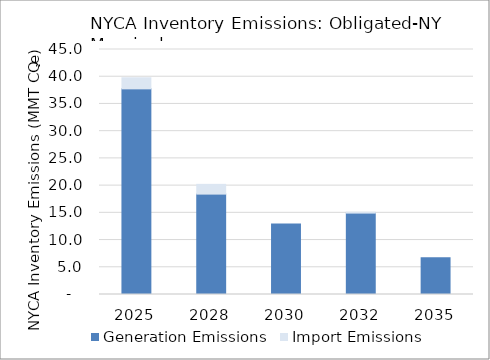
| Category | Generation Emissions  | Import Emissions |
|---|---|---|
| 2025.0 | 37.77 | 2.04 |
| 2028.0 | 18.44 | 1.79 |
| 2030.0 | 12.97 | 0 |
| 2032.0 | 14.95 | 0.18 |
| 2035.0 | 6.73 | 0 |